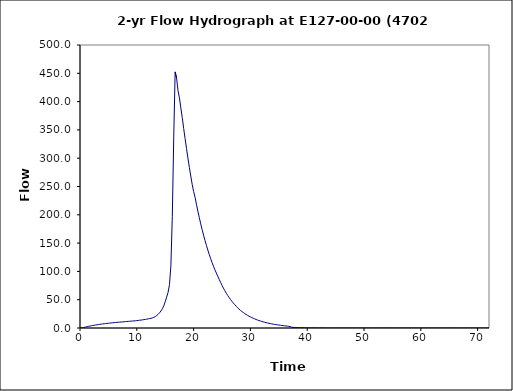
| Category | Series 0 |
|---|---|
| 0.0 | 0 |
| 0.25 | 0.1 |
| 0.5 | 0.4 |
| 0.75 | 1 |
| 1.0 | 1.7 |
| 1.25 | 2.3 |
| 1.5 | 2.9 |
| 1.75 | 3.4 |
| 2.0 | 3.9 |
| 2.25 | 4.4 |
| 2.5 | 4.9 |
| 2.75 | 5.3 |
| 3.0 | 5.7 |
| 3.25 | 6.1 |
| 3.5 | 6.5 |
| 3.75 | 6.9 |
| 4.0 | 7.2 |
| 4.25 | 7.5 |
| 4.5 | 7.8 |
| 4.75 | 8.1 |
| 5.0 | 8.4 |
| 5.25 | 8.7 |
| 5.5 | 9 |
| 5.75 | 9.2 |
| 6.0 | 9.5 |
| 6.25 | 9.7 |
| 6.5 | 10 |
| 6.75 | 10.2 |
| 7.0 | 10.4 |
| 7.25 | 10.6 |
| 7.5 | 10.8 |
| 7.75 | 11 |
| 8.0 | 11.3 |
| 8.25 | 11.5 |
| 8.5 | 11.7 |
| 8.75 | 11.9 |
| 9.0 | 12.1 |
| 9.25 | 12.3 |
| 9.5 | 12.6 |
| 9.75 | 12.8 |
| 10.0 | 13.1 |
| 10.25 | 13.4 |
| 10.5 | 13.7 |
| 10.75 | 14 |
| 11.0 | 14.4 |
| 11.25 | 14.8 |
| 11.5 | 15.2 |
| 11.75 | 15.6 |
| 12.0 | 16.1 |
| 12.25 | 16.6 |
| 12.5 | 17.1 |
| 12.75 | 17.8 |
| 13.0 | 18.8 |
| 13.25 | 20.2 |
| 13.5 | 22 |
| 13.75 | 24.1 |
| 14.0 | 26.8 |
| 14.25 | 30.1 |
| 14.5 | 34 |
| 14.75 | 39.2 |
| 15.0 | 46.4 |
| 15.25 | 54.5 |
| 15.5 | 62.8 |
| 15.75 | 76.5 |
| 16.0 | 109.9 |
| 16.25 | 196.9 |
| 16.5 | 335.9 |
| 16.75 | 452.5 |
| 17.0 | 441.6 |
| 17.25 | 419.9 |
| 17.5 | 406.6 |
| 17.75 | 388.9 |
| 18.0 | 371.7 |
| 18.25 | 352.8 |
| 18.5 | 334.7 |
| 18.75 | 317.1 |
| 19.0 | 300.1 |
| 19.25 | 283.9 |
| 19.5 | 268.4 |
| 19.75 | 253.7 |
| 20.0 | 241.1 |
| 20.25 | 231 |
| 20.5 | 218.7 |
| 20.75 | 206.5 |
| 21.0 | 195 |
| 21.25 | 184.1 |
| 21.5 | 173.8 |
| 21.75 | 164 |
| 22.0 | 154.8 |
| 22.25 | 146.1 |
| 22.5 | 137.8 |
| 22.75 | 129.9 |
| 23.0 | 122.5 |
| 23.25 | 115.5 |
| 23.5 | 109 |
| 23.75 | 102.8 |
| 24.0 | 97.1 |
| 24.25 | 91.5 |
| 24.5 | 86 |
| 24.75 | 80.6 |
| 25.0 | 75.3 |
| 25.25 | 70.4 |
| 25.5 | 65.8 |
| 25.75 | 61.5 |
| 26.0 | 57.5 |
| 26.25 | 53.8 |
| 26.5 | 50.3 |
| 26.75 | 47 |
| 27.0 | 44 |
| 27.25 | 41.1 |
| 27.5 | 38.4 |
| 27.75 | 35.8 |
| 28.0 | 33.3 |
| 28.25 | 31.1 |
| 28.5 | 29.1 |
| 28.75 | 27.3 |
| 29.0 | 25.5 |
| 29.25 | 23.9 |
| 29.5 | 22.4 |
| 29.75 | 20.9 |
| 30.0 | 19.6 |
| 30.25 | 18.4 |
| 30.5 | 17.2 |
| 30.75 | 16.1 |
| 31.0 | 15.1 |
| 31.25 | 14.1 |
| 31.5 | 13.2 |
| 31.75 | 12.4 |
| 32.0 | 11.6 |
| 32.25 | 10.9 |
| 32.5 | 10.2 |
| 32.75 | 9.5 |
| 33.0 | 8.9 |
| 33.25 | 8.3 |
| 33.5 | 7.8 |
| 33.75 | 7.3 |
| 34.0 | 6.8 |
| 34.25 | 6.4 |
| 34.5 | 6 |
| 34.75 | 5.6 |
| 35.0 | 5.2 |
| 35.25 | 4.9 |
| 35.5 | 4.5 |
| 35.75 | 4.2 |
| 36.0 | 3.9 |
| 36.25 | 3.6 |
| 36.5 | 3.3 |
| 36.75 | 2.9 |
| 37.0 | 2.4 |
| 37.25 | 1.6 |
| 37.5 | 1.1 |
| 37.75 | 0.9 |
| 38.0 | 0.8 |
| 38.25 | 0.7 |
| 38.5 | 0.6 |
| 38.75 | 0.5 |
| 39.0 | 0.5 |
| 39.25 | 0.4 |
| 39.5 | 0.4 |
| 39.75 | 0.3 |
| 40.0 | 0.3 |
| 40.25 | 0.3 |
| 40.5 | 0.2 |
| 40.75 | 0.2 |
| 41.0 | 0.2 |
| 41.25 | 0.2 |
| 41.5 | 0.1 |
| 41.75 | 0.1 |
| 42.0 | 0.1 |
| 42.25 | 0.1 |
| 42.5 | 0.1 |
| 42.75 | 0.1 |
| 43.0 | 0.1 |
| 43.25 | 0 |
| 43.5 | 0 |
| 43.75 | 0 |
| 44.0 | 0 |
| 44.25 | 0 |
| 44.5 | 0 |
| 44.75 | 0 |
| 45.0 | 0 |
| 45.25 | 0 |
| 45.5 | 0 |
| 45.75 | 0 |
| 46.0 | 0 |
| 46.25 | 0 |
| 46.5 | 0 |
| 46.75 | 0 |
| 47.0 | 0 |
| 47.25 | 0 |
| 47.5 | 0 |
| 47.75 | 0 |
| 48.0 | 0 |
| 48.25 | 0 |
| 48.5 | 0 |
| 48.75 | 0 |
| 49.0 | 0 |
| 49.25 | 0 |
| 49.5 | 0 |
| 49.75 | 0 |
| 50.0 | 0 |
| 50.25 | 0 |
| 50.5 | 0 |
| 50.75 | 0 |
| 51.0 | 0 |
| 51.25 | 0 |
| 51.5 | 0 |
| 51.75 | 0 |
| 52.0 | 0 |
| 52.25 | 0 |
| 52.5 | 0 |
| 52.75 | 0 |
| 53.0 | 0 |
| 53.25 | 0 |
| 53.5 | 0 |
| 53.75 | 0 |
| 54.0 | 0 |
| 54.25 | 0 |
| 54.5 | 0 |
| 54.75 | 0 |
| 55.0 | 0 |
| 55.25 | 0 |
| 55.5 | 0 |
| 55.75 | 0 |
| 56.0 | 0 |
| 56.25 | 0 |
| 56.5 | 0 |
| 56.75 | 0 |
| 57.0 | 0 |
| 57.25 | 0 |
| 57.5 | 0 |
| 57.75 | 0 |
| 58.0 | 0 |
| 58.25 | 0 |
| 58.5 | 0 |
| 58.75 | 0 |
| 59.0 | 0 |
| 59.25 | 0 |
| 59.5 | 0 |
| 59.75 | 0 |
| 60.0 | 0 |
| 60.25 | 0 |
| 60.5 | 0 |
| 60.75 | 0 |
| 61.0 | 0 |
| 61.25 | 0 |
| 61.5 | 0 |
| 61.75 | 0 |
| 62.0 | 0 |
| 62.25 | 0 |
| 62.5 | 0 |
| 62.75 | 0 |
| 63.0 | 0 |
| 63.25 | 0 |
| 63.5 | 0 |
| 63.75 | 0 |
| 64.0 | 0 |
| 64.25 | 0 |
| 64.5 | 0 |
| 64.75 | 0 |
| 65.0 | 0 |
| 65.25 | 0 |
| 65.5 | 0 |
| 65.75 | 0 |
| 66.0 | 0 |
| 66.25 | 0 |
| 66.5 | 0 |
| 66.75 | 0 |
| 67.0 | 0 |
| 67.25 | 0 |
| 67.5 | 0 |
| 67.75 | 0 |
| 68.0 | 0 |
| 68.25 | 0 |
| 68.5 | 0 |
| 68.75 | 0 |
| 69.0 | 0 |
| 69.25 | 0 |
| 69.5 | 0 |
| 69.75 | 0 |
| 70.0 | 0 |
| 70.25 | 0 |
| 70.5 | 0 |
| 70.75 | 0 |
| 71.0 | 0 |
| 71.25 | 0 |
| 71.5 | 0 |
| 71.75 | 0 |
| 72.0 | 0 |
| 72.25 | 0 |
| 72.5 | 0 |
| 72.75 | 0 |
| 73.0 | 0 |
| 73.25 | 0 |
| 73.5 | 0 |
| 73.75 | 0 |
| 74.0 | 0 |
| 74.25 | 0 |
| 74.5 | 0 |
| 74.75 | 0 |
| 75.0 | 0 |
| 75.25 | 0 |
| 75.5 | 0 |
| 75.75 | 0 |
| 76.0 | 0 |
| 76.25 | 0 |
| 76.5 | 0 |
| 76.75 | 0 |
| 77.0 | 0 |
| 77.25 | 0 |
| 77.5 | 0 |
| 77.75 | 0 |
| 78.0 | 0 |
| 78.25 | 0 |
| 78.5 | 0 |
| 78.75 | 0 |
| 79.0 | 0 |
| 79.25 | 0 |
| 79.5 | 0 |
| 79.75 | 0 |
| 80.0 | 0 |
| 80.25 | 0 |
| 80.5 | 0 |
| 80.75 | 0 |
| 81.0 | 0 |
| 81.25 | 0 |
| 81.5 | 0 |
| 81.75 | 0 |
| 82.0 | 0 |
| 82.25 | 0 |
| 82.5 | 0 |
| 82.75 | 0 |
| 83.0 | 0 |
| 83.25 | 0 |
| 83.5 | 0 |
| 83.75 | 0 |
| 84.0 | 0 |
| 84.25 | 0 |
| 84.5 | 0 |
| 84.75 | 0 |
| 85.0 | 0 |
| 85.25 | 0 |
| 85.5 | 0 |
| 85.75 | 0 |
| 86.0 | 0 |
| 86.25 | 0 |
| 86.5 | 0 |
| 86.75 | 0 |
| 87.0 | 0 |
| 87.25 | 0 |
| 87.5 | 0 |
| 87.75 | 0 |
| 88.0 | 0 |
| 88.25 | 0 |
| 88.5 | 0 |
| 88.75 | 0 |
| 89.0 | 0 |
| 89.25 | 0 |
| 89.5 | 0 |
| 89.75 | 0 |
| 90.0 | 0 |
| 90.25 | 0 |
| 90.5 | 0 |
| 90.75 | 0 |
| 91.0 | 0 |
| 91.25 | 0 |
| 91.5 | 0 |
| 91.75 | 0 |
| 92.0 | 0 |
| 92.25 | 0 |
| 92.5 | 0 |
| 92.75 | 0 |
| 93.0 | 0 |
| 93.25 | 0 |
| 93.5 | 0 |
| 93.75 | 0 |
| 94.0 | 0 |
| 94.25 | 0 |
| 94.5 | 0 |
| 94.75 | 0 |
| 95.0 | 0 |
| 95.25 | 0 |
| 95.5 | 0 |
| 95.75 | 0 |
| 96.0 | 0 |
| 96.25 | 0 |
| 96.5 | 0 |
| 96.75 | 0 |
| 97.0 | 0 |
| 97.25 | 0 |
| 97.5 | 0 |
| 97.75 | 0 |
| 98.0 | 0 |
| 98.25 | 0 |
| 98.5 | 0 |
| 98.75 | 0 |
| 99.0 | 0 |
| 99.25 | 0 |
| 99.5 | 0 |
| 99.75 | 0 |
| 100.0 | 0 |
| 100.25 | 0 |
| 100.5 | 0 |
| 100.75 | 0 |
| 101.0 | 0 |
| 101.25 | 0 |
| 101.5 | 0 |
| 101.75 | 0 |
| 102.0 | 0 |
| 102.25 | 0 |
| 102.5 | 0 |
| 102.75 | 0 |
| 103.0 | 0 |
| 103.25 | 0 |
| 103.5 | 0 |
| 103.75 | 0 |
| 104.0 | 0 |
| 104.25 | 0 |
| 104.5 | 0 |
| 104.75 | 0 |
| 105.0 | 0 |
| 105.25 | 0 |
| 105.5 | 0 |
| 105.75 | 0 |
| 106.0 | 0 |
| 106.25 | 0 |
| 106.5 | 0 |
| 106.75 | 0 |
| 107.0 | 0 |
| 107.25 | 0 |
| 107.5 | 0 |
| 107.75 | 0 |
| 108.0 | 0 |
| 108.25 | 0 |
| 108.5 | 0 |
| 108.75 | 0 |
| 109.0 | 0 |
| 109.25 | 0 |
| 109.5 | 0 |
| 109.75 | 0 |
| 110.0 | 0 |
| 110.25 | 0 |
| 110.5 | 0 |
| 110.75 | 0 |
| 111.0 | 0 |
| 111.25 | 0 |
| 111.5 | 0 |
| 111.75 | 0 |
| 112.0 | 0 |
| 112.25 | 0 |
| 112.5 | 0 |
| 112.75 | 0 |
| 113.0 | 0 |
| 113.25 | 0 |
| 113.5 | 0 |
| 113.75 | 0 |
| 114.0 | 0 |
| 114.25 | 0 |
| 114.5 | 0 |
| 114.75 | 0 |
| 115.0 | 0 |
| 115.25 | 0 |
| 115.5 | 0 |
| 115.75 | 0 |
| 116.0 | 0 |
| 116.25 | 0 |
| 116.5 | 0 |
| 116.75 | 0 |
| 117.0 | 0 |
| 117.25 | 0 |
| 117.5 | 0 |
| 117.75 | 0 |
| 118.0 | 0 |
| 118.25 | 0 |
| 118.5 | 0 |
| 118.75 | 0 |
| 119.0 | 0 |
| 119.25 | 0 |
| 119.5 | 0 |
| 119.75 | 0 |
| 120.0 | 0 |
| 120.25 | 0 |
| 120.5 | 0 |
| 120.75 | 0 |
| 121.0 | 0 |
| 121.25 | 0 |
| 121.5 | 0 |
| 121.75 | 0 |
| 122.0 | 0 |
| 122.25 | 0 |
| 122.5 | 0 |
| 122.75 | 0 |
| 123.0 | 0 |
| 123.25 | 0 |
| 123.5 | 0 |
| 123.75 | 0 |
| 124.0 | 0 |
| 124.25 | 0 |
| 124.5 | 0 |
| 124.75 | 0 |
| 125.0 | 0 |
| 125.25 | 0 |
| 125.5 | 0 |
| 125.75 | 0 |
| 126.0 | 0 |
| 126.25 | 0 |
| 126.5 | 0 |
| 126.75 | 0 |
| 127.0 | 0 |
| 127.25 | 0 |
| 127.5 | 0 |
| 127.75 | 0 |
| 128.0 | 0 |
| 128.25 | 0 |
| 128.5 | 0 |
| 128.75 | 0 |
| 129.0 | 0 |
| 129.25 | 0 |
| 129.5 | 0 |
| 129.75 | 0 |
| 130.0 | 0 |
| 130.25 | 0 |
| 130.5 | 0 |
| 130.75 | 0 |
| 131.0 | 0 |
| 131.25 | 0 |
| 131.5 | 0 |
| 131.75 | 0 |
| 132.0 | 0 |
| 132.25 | 0 |
| 132.5 | 0 |
| 132.75 | 0 |
| 133.0 | 0 |
| 133.25 | 0 |
| 133.5 | 0 |
| 133.75 | 0 |
| 134.0 | 0 |
| 134.25 | 0 |
| 134.5 | 0 |
| 134.75 | 0 |
| 135.0 | 0 |
| 135.25 | 0 |
| 135.5 | 0 |
| 135.75 | 0 |
| 136.0 | 0 |
| 136.25 | 0 |
| 136.5 | 0 |
| 136.75 | 0 |
| 137.0 | 0 |
| 137.25 | 0 |
| 137.5 | 0 |
| 137.75 | 0 |
| 138.0 | 0 |
| 138.25 | 0 |
| 138.5 | 0 |
| 138.75 | 0 |
| 139.0 | 0 |
| 139.25 | 0 |
| 139.5 | 0 |
| 139.75 | 0 |
| 140.0 | 0 |
| 140.25 | 0 |
| 140.5 | 0 |
| 140.75 | 0 |
| 141.0 | 0 |
| 141.25 | 0 |
| 141.5 | 0 |
| 141.75 | 0 |
| 142.0 | 0 |
| 142.25 | 0 |
| 142.5 | 0 |
| 142.75 | 0 |
| 143.0 | 0 |
| 143.25 | 0 |
| 143.5 | 0 |
| 143.75 | 0 |
| 144.0 | 0 |
| 144.25 | 0 |
| 144.5 | 0 |
| 144.75 | 0 |
| 145.0 | 0 |
| 145.25 | 0 |
| 145.5 | 0 |
| 145.75 | 0 |
| 146.0 | 0 |
| 146.25 | 0 |
| 146.5 | 0 |
| 146.75 | 0 |
| 147.0 | 0 |
| 147.25 | 0 |
| 147.5 | 0 |
| 147.75 | 0 |
| 148.0 | 0 |
| 148.25 | 0 |
| 148.5 | 0 |
| 148.75 | 0 |
| 149.0 | 0 |
| 149.25 | 0 |
| 149.5 | 0 |
| 149.75 | 0 |
| 150.0 | 0 |
| 150.25 | 0 |
| 150.5 | 0 |
| 150.75 | 0 |
| 151.0 | 0 |
| 151.25 | 0 |
| 151.5 | 0 |
| 151.75 | 0 |
| 152.0 | 0 |
| 152.25 | 0 |
| 152.5 | 0 |
| 152.75 | 0 |
| 153.0 | 0 |
| 153.25 | 0 |
| 153.5 | 0 |
| 153.75 | 0 |
| 154.0 | 0 |
| 154.25 | 0 |
| 154.5 | 0 |
| 154.75 | 0 |
| 155.0 | 0 |
| 155.25 | 0 |
| 155.5 | 0 |
| 155.75 | 0 |
| 156.0 | 0 |
| 156.25 | 0 |
| 156.5 | 0 |
| 156.75 | 0 |
| 157.0 | 0 |
| 157.25 | 0 |
| 157.5 | 0 |
| 157.75 | 0 |
| 158.0 | 0 |
| 158.25 | 0 |
| 158.5 | 0 |
| 158.75 | 0 |
| 159.0 | 0 |
| 159.25 | 0 |
| 159.5 | 0 |
| 159.75 | 0 |
| 160.0 | 0 |
| 160.25 | 0 |
| 160.5 | 0 |
| 160.75 | 0 |
| 161.0 | 0 |
| 161.25 | 0 |
| 161.5 | 0 |
| 161.75 | 0 |
| 162.0 | 0 |
| 162.25 | 0 |
| 162.5 | 0 |
| 162.75 | 0 |
| 163.0 | 0 |
| 163.25 | 0 |
| 163.5 | 0 |
| 163.75 | 0 |
| 164.0 | 0 |
| 164.25 | 0 |
| 164.5 | 0 |
| 164.75 | 0 |
| 165.0 | 0 |
| 165.25 | 0 |
| 165.5 | 0 |
| 165.75 | 0 |
| 166.0 | 0 |
| 166.25 | 0 |
| 166.5 | 0 |
| 166.75 | 0 |
| 167.0 | 0 |
| 167.25 | 0 |
| 167.5 | 0 |
| 167.75 | 0 |
| 168.0 | 0 |
| 168.25 | 0 |
| 168.5 | 0 |
| 168.75 | 0 |
| 169.0 | 0 |
| 169.25 | 0 |
| 169.5 | 0 |
| 169.75 | 0 |
| 170.0 | 0 |
| 170.25 | 0 |
| 170.5 | 0 |
| 170.75 | 0 |
| 171.0 | 0 |
| 171.25 | 0 |
| 171.5 | 0 |
| 171.75 | 0 |
| 172.0 | 0 |
| 172.25 | 0 |
| 172.5 | 0 |
| 172.75 | 0 |
| 173.0 | 0 |
| 173.25 | 0 |
| 173.5 | 0 |
| 173.75 | 0 |
| 174.0 | 0 |
| 174.25 | 0 |
| 174.5 | 0 |
| 174.75 | 0 |
| 175.0 | 0 |
| 175.25 | 0 |
| 175.5 | 0 |
| 175.75 | 0 |
| 176.0 | 0 |
| 176.25 | 0 |
| 176.5 | 0 |
| 176.75 | 0 |
| 177.0 | 0 |
| 177.25 | 0 |
| 177.5 | 0 |
| 177.75 | 0 |
| 178.0 | 0 |
| 178.25 | 0 |
| 178.5 | 0 |
| 178.75 | 0 |
| 179.0 | 0 |
| 179.25 | 0 |
| 179.5 | 0 |
| 179.75 | 0 |
| 180.0 | 0 |
| 180.25 | 0 |
| 180.5 | 0 |
| 180.75 | 0 |
| 181.0 | 0 |
| 181.25 | 0 |
| 181.5 | 0 |
| 181.75 | 0 |
| 182.0 | 0 |
| 182.25 | 0 |
| 182.5 | 0 |
| 182.75 | 0 |
| 183.0 | 0 |
| 183.25 | 0 |
| 183.5 | 0 |
| 183.75 | 0 |
| 184.0 | 0 |
| 184.25 | 0 |
| 184.5 | 0 |
| 184.75 | 0 |
| 185.0 | 0 |
| 185.25 | 0 |
| 185.5 | 0 |
| 185.75 | 0 |
| 186.0 | 0 |
| 186.25 | 0 |
| 186.5 | 0 |
| 186.75 | 0 |
| 187.0 | 0 |
| 187.25 | 0 |
| 187.5 | 0 |
| 187.75 | 0 |
| 188.0 | 0 |
| 188.25 | 0 |
| 188.5 | 0 |
| 188.75 | 0 |
| 189.0 | 0 |
| 189.25 | 0 |
| 189.5 | 0 |
| 189.75 | 0 |
| 190.0 | 0 |
| 190.25 | 0 |
| 190.5 | 0 |
| 190.75 | 0 |
| 191.0 | 0 |
| 191.25 | 0 |
| 191.5 | 0 |
| 191.75 | 0 |